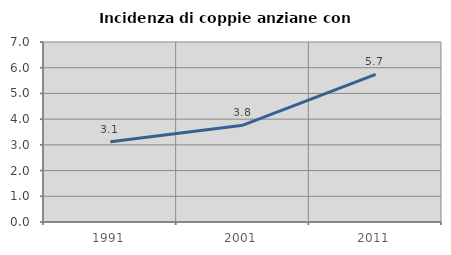
| Category | Incidenza di coppie anziane con figli |
|---|---|
| 1991.0 | 3.118 |
| 2001.0 | 3.764 |
| 2011.0 | 5.739 |